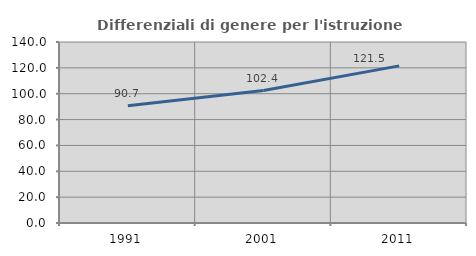
| Category | Differenziali di genere per l'istruzione superiore |
|---|---|
| 1991.0 | 90.677 |
| 2001.0 | 102.426 |
| 2011.0 | 121.524 |